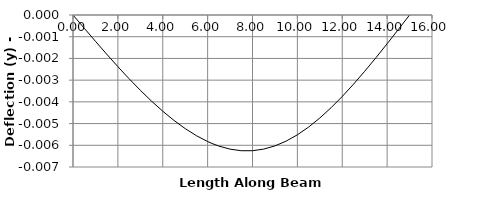
| Category | y |
|---|---|
| 0.0 | 0 |
| 0.5 | -0.001 |
| 1.0 | -0.001 |
| 1.5 | -0.002 |
| 2.0 | -0.002 |
| 2.5 | -0.003 |
| 3.0 | -0.003 |
| 3.5 | -0.004 |
| 4.0 | -0.004 |
| 4.5 | -0.005 |
| 5.0 | -0.005 |
| 5.5 | -0.006 |
| 6.0 | -0.006 |
| 6.20001 | -0.006 |
| 6.5 | -0.006 |
| 7.0 | -0.006 |
| 7.5 | -0.006 |
| 8.0 | -0.006 |
| 8.5 | -0.006 |
| 9.0 | -0.006 |
| 9.5 | -0.006 |
| 10.0 | -0.006 |
| 10.5 | -0.005 |
| 11.0 | -0.005 |
| 11.00001 | -0.005 |
| 11.5 | -0.004 |
| 12.0 | -0.004 |
| 12.5 | -0.003 |
| 13.0 | -0.003 |
| 13.5 | -0.002 |
| 14.0 | -0.001 |
| 14.5 | -0.001 |
| 15.0 | 0 |
| 15.0 | 0 |